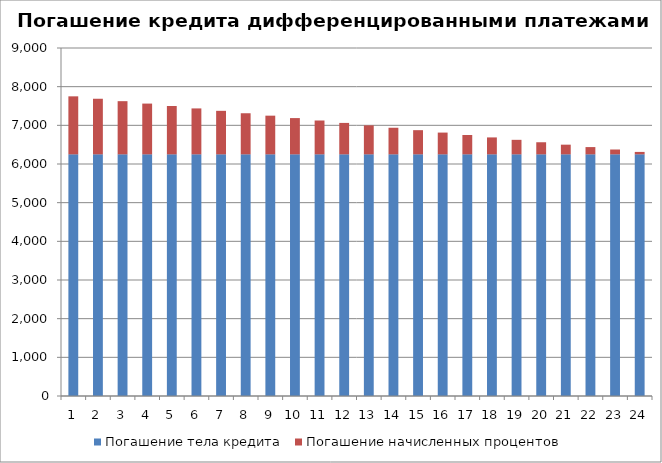
| Category | Погашение тела кредита | Погашение начисленных процентов |
|---|---|---|
| 1.0 | 6250 | 1500 |
| 2.0 | 6250 | 1437.5 |
| 3.0 | 6250 | 1375 |
| 4.0 | 6250 | 1312.5 |
| 5.0 | 6250 | 1250 |
| 6.0 | 6250 | 1187.5 |
| 7.0 | 6250 | 1125 |
| 8.0 | 6250 | 1062.5 |
| 9.0 | 6250 | 1000 |
| 10.0 | 6250 | 937.5 |
| 11.0 | 6250 | 875 |
| 12.0 | 6250 | 812.5 |
| 13.0 | 6250 | 750 |
| 14.0 | 6250 | 687.5 |
| 15.0 | 6250 | 625 |
| 16.0 | 6250 | 562.5 |
| 17.0 | 6250 | 500 |
| 18.0 | 6250 | 437.5 |
| 19.0 | 6250 | 375 |
| 20.0 | 6250 | 312.5 |
| 21.0 | 6250 | 250 |
| 22.0 | 6250 | 187.5 |
| 23.0 | 6250 | 125 |
| 24.0 | 6250 | 62.5 |